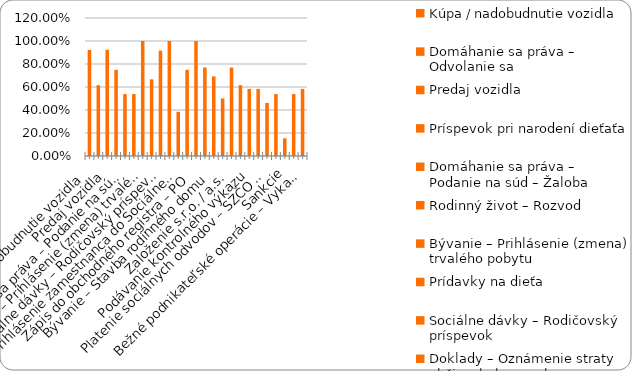
| Category | % |
|---|---|
| Kúpa / nadobudnutie vozidla | 0.923 |
| Domáhanie sa práva – Odvolanie sa | 0.615 |
| Predaj vozidla | 0.923 |
| Príspevok pri narodení dieťaťa | 0.75 |
| Domáhanie sa práva – Podanie na súd – Žaloba | 0.538 |
| Rodinný život – Rozvod | 0.538 |
| Bývanie – Prihlásenie (zmena) trvalého pobytu | 1 |
| Prídavky na dieťa | 0.667 |
| Sociálne dávky – Rodičovský príspevok | 0.917 |
| Doklady – Oznámenie straty občianskeho preukazu | 1 |
| Prihlásenie zamestnanca do Sociálnej poisťovne | 0.385 |
| Plnenie si daňových povinností – zamestnanec (FO) | 0.75 |
| Zápis do obchodného registra – PO | 1 |
| Živnosť - ukončenie | 0.769 |
| Bývanie – Stavba rodinného domu | 0.692 |
| Sociálne dávky – Príspevok v nezamestnanosti | 0.5 |
| Založenie s.r.o. / a.s. | 0.769 |
| Živnosť – založenie | 0.615 |
| Podávanie kontrolného výkazu | 0.583 |
| Plnenie si daňových povinností – SZČO / PO  | 0.583 |
| Platenie sociálnych odvodov – SZČO / PO | 0.462 |
| Živnosť - prerušenie | 0.538 |
| Sankcie | 0.154 |
| Živnosť - zmena | 0.538 |
| Bežné podnikateľské operácie – Vykazovanie štatistík | 0.583 |